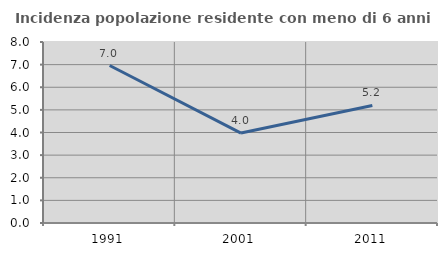
| Category | Incidenza popolazione residente con meno di 6 anni |
|---|---|
| 1991.0 | 6.961 |
| 2001.0 | 3.976 |
| 2011.0 | 5.197 |